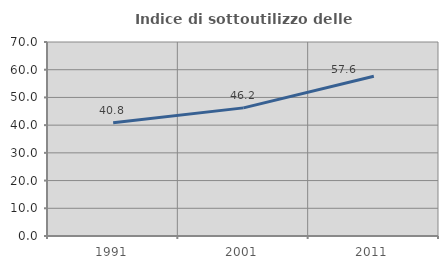
| Category | Indice di sottoutilizzo delle abitazioni  |
|---|---|
| 1991.0 | 40.84 |
| 2001.0 | 46.228 |
| 2011.0 | 57.643 |